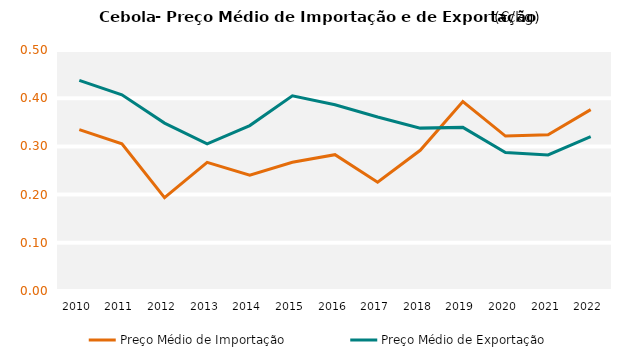
| Category | Preço Médio de Importação | Preço Médio de Exportação |
|---|---|---|
| 2010.0 | 0.335 | 0.437 |
| 2011.0 | 0.305 | 0.407 |
| 2012.0 | 0.194 | 0.348 |
| 2013.0 | 0.267 | 0.305 |
| 2014.0 | 0.24 | 0.343 |
| 2015.0 | 0.267 | 0.405 |
| 2016.0 | 0.283 | 0.386 |
| 2017.0 | 0.226 | 0.361 |
| 2018.0 | 0.292 | 0.338 |
| 2019.0 | 0.393 | 0.339 |
| 2020.0 | 0.321 | 0.287 |
| 2021.0 | 0.324 | 0.282 |
| 2022.0 | 0.376 | 0.32 |